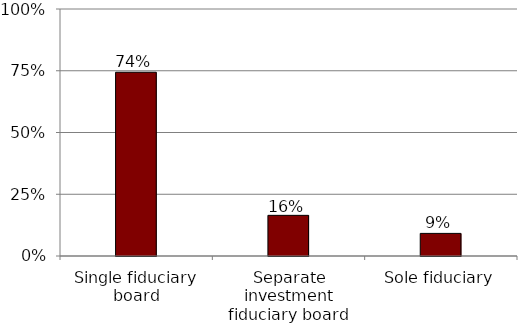
| Category | Series 0 |
|---|---|
| Single fiduciary board | 0.744 |
| Separate investment fiduciary board | 0.165 |
| Sole fiduciary | 0.092 |